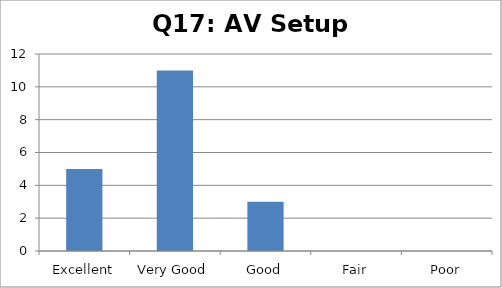
| Category | Response count |
|---|---|
| Excellent | 5 |
| Very Good | 11 |
| Good | 3 |
| Fair | 0 |
| Poor | 0 |